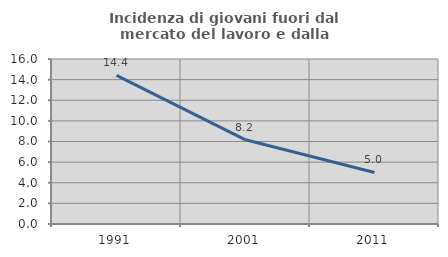
| Category | Incidenza di giovani fuori dal mercato del lavoro e dalla formazione  |
|---|---|
| 1991.0 | 14.407 |
| 2001.0 | 8.163 |
| 2011.0 | 5 |